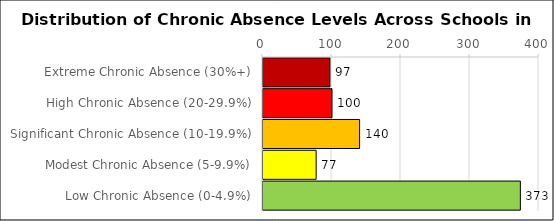
| Category | Number of Schools |
|---|---|
| Extreme Chronic Absence (30%+) | 97 |
| High Chronic Absence (20-29.9%) | 100 |
| Significant Chronic Absence (10-19.9%) | 140 |
| Modest Chronic Absence (5-9.9%) | 77 |
| Low Chronic Absence (0-4.9%) | 373 |